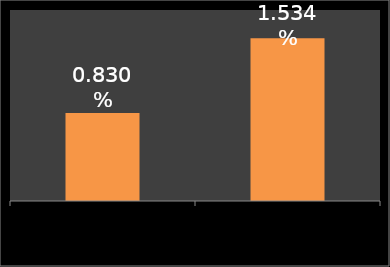
| Category | LOPEZ |
|---|---|
| % en la clase política | 0.008 |
| % en la sociedad  | 0.015 |